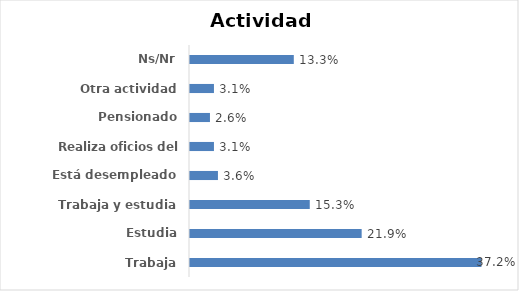
| Category | Series 0 |
|---|---|
| Trabaja | 0.372 |
| Estudia | 0.219 |
| Trabaja y estudia | 0.153 |
| Está desempleado | 0.036 |
| Realiza oficios del hogar | 0.031 |
| Pensionado | 0.026 |
| Otra actividad | 0.031 |
| Ns/Nr | 0.133 |